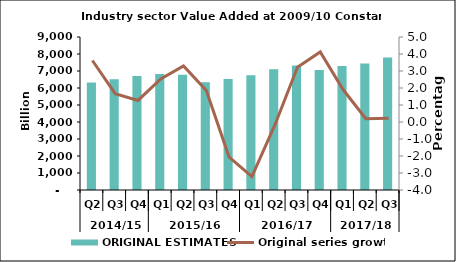
| Category | ORIGINAL ESTIMATES |
|---|---|
| 0 | 6330.347 |
| 1 | 6510.512 |
| 2 | 6700.056 |
| 3 | 6821.823 |
| 4 | 6782.223 |
| 5 | 6342.987 |
| 6 | 6523.848 |
| 7 | 6754.597 |
| 8 | 7105.958 |
| 9 | 7322.414 |
| 10 | 7065.357 |
| 11 | 7287.572 |
| 12 | 7434.439 |
| 13 | 7795.884 |